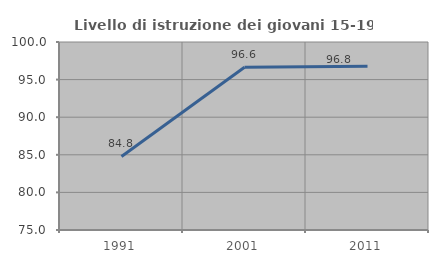
| Category | Livello di istruzione dei giovani 15-19 anni |
|---|---|
| 1991.0 | 84.783 |
| 2001.0 | 96.644 |
| 2011.0 | 96.767 |